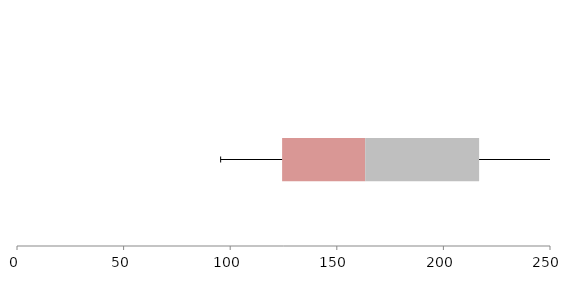
| Category | Series 1 | Series 2 | Series 3 |
|---|---|---|---|
| 0 | 124.353 | 38.97 | 53.429 |